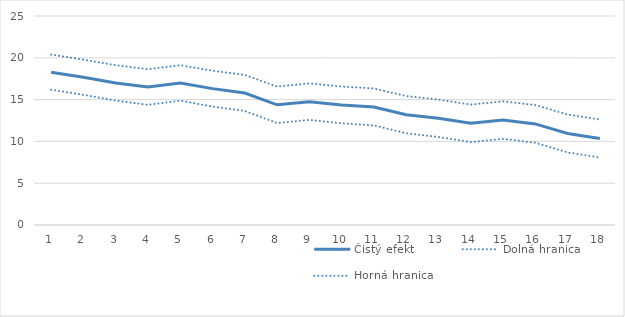
| Category | Čistý efekt | Dolná hranica | Horná hranica |
|---|---|---|---|
| 1.0 | 18.281 | 16.179 | 20.382 |
| 2.0 | 17.678 | 15.574 | 19.781 |
| 3.0 | 16.998 | 14.882 | 19.113 |
| 4.0 | 16.506 | 14.376 | 18.635 |
| 5.0 | 16.992 | 14.871 | 19.112 |
| 6.0 | 16.311 | 14.167 | 18.456 |
| 7.0 | 15.793 | 13.634 | 17.951 |
| 8.0 | 14.377 | 12.195 | 16.559 |
| 9.0 | 14.756 | 12.576 | 16.937 |
| 10.0 | 14.365 | 12.166 | 16.565 |
| 11.0 | 14.123 | 11.915 | 16.331 |
| 12.0 | 13.199 | 10.971 | 15.428 |
| 13.0 | 12.766 | 10.531 | 15.001 |
| 14.0 | 12.161 | 9.917 | 14.404 |
| 15.0 | 12.551 | 10.307 | 14.795 |
| 16.0 | 12.09 | 9.836 | 14.344 |
| 17.0 | 10.947 | 8.681 | 13.212 |
| 18.0 | 10.343 | 8.068 | 12.618 |